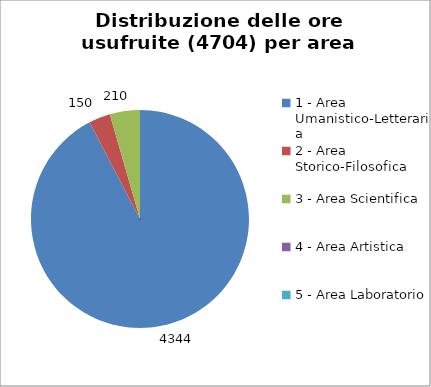
| Category | Nr. Ore Usufruite |
|---|---|
| 1 - Area Umanistico-Letteraria | 4344 |
| 2 - Area Storico-Filosofica | 150 |
| 3 - Area Scientifica | 210 |
| 4 - Area Artistica | 0 |
| 5 - Area Laboratorio | 0 |